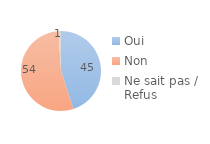
| Category | Series 0 |
|---|---|
| Oui | 45 |
| Non | 54 |
| Ne sait pas / Refus | 1 |